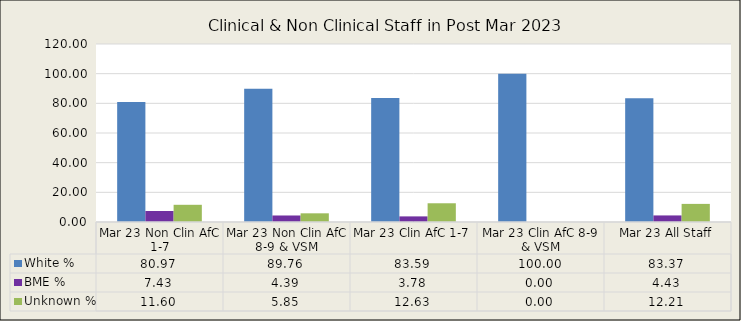
| Category | White % | BME % | Unknown % |
|---|---|---|---|
| Mar 23 Non Clin AfC 1-7 | 80.971 | 7.433 | 11.596 |
| Mar 23 Non Clin AfC 8-9 & VSM | 89.756 | 4.39 | 5.854 |
| Mar 23 Clin AfC 1-7 | 83.591 | 3.78 | 12.629 |
| Mar 23 Clin AfC 8-9 & VSM | 100 | 0 | 0 |
| Mar 23 All Staff | 83.367 | 4.426 | 12.206 |